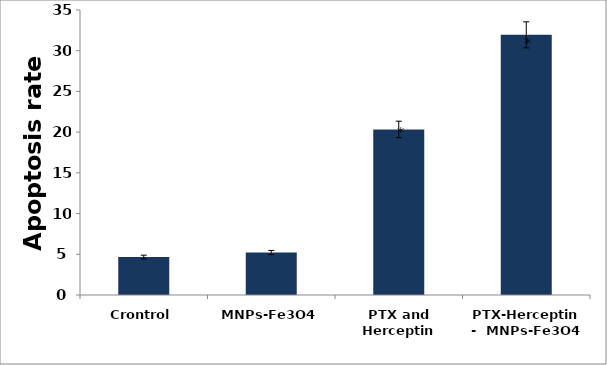
| Category | Series 0 |
|---|---|
| Crontrol | 4.66 |
| MNPs-Fe3O4 | 5.21 |
| PTX and Herceptin | 20.33 |
| PTX-Herceptin-  MNPs-Fe3O4 | 31.95 |